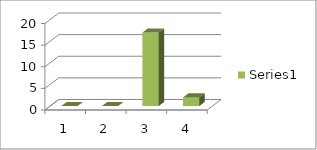
| Category | Series 0 |
|---|---|
| 0 | 0 |
| 1 | 0 |
| 2 | 17 |
| 3 | 2 |